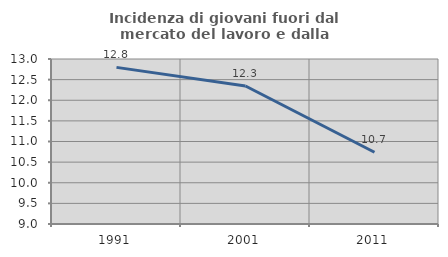
| Category | Incidenza di giovani fuori dal mercato del lavoro e dalla formazione  |
|---|---|
| 1991.0 | 12.797 |
| 2001.0 | 12.346 |
| 2011.0 | 10.74 |